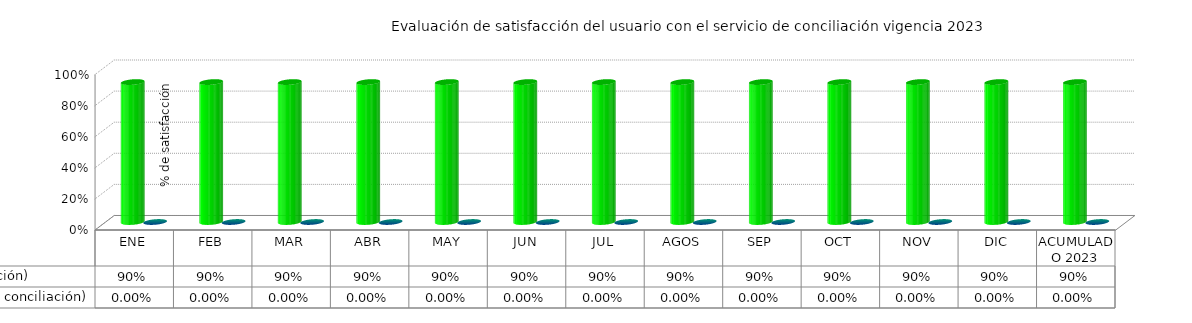
| Category | % Meta (calificación obtenida - nivel de satisfacción) | Calificación obtenida (evaluación del servicio de conciliación) |
|---|---|---|
| ENE | 0.9 | 0 |
| FEB | 0.9 | 0 |
| MAR | 0.9 | 0 |
| ABR | 0.9 | 0 |
| MAY | 0.9 | 0 |
| JUN | 0.9 | 0 |
| JUL | 0.9 | 0 |
| AGOS | 0.9 | 0 |
| SEP | 0.9 | 0 |
| OCT | 0.9 | 0 |
| NOV | 0.9 | 0 |
| DIC | 0.9 | 0 |
| ACUMULADO 2023 | 0.9 | 0 |